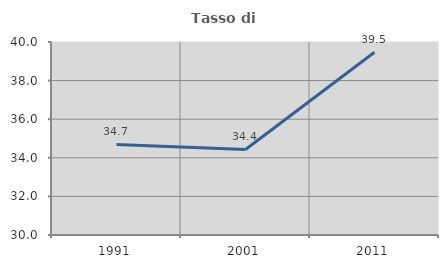
| Category | Tasso di occupazione   |
|---|---|
| 1991.0 | 34.691 |
| 2001.0 | 34.433 |
| 2011.0 | 39.469 |